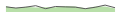
| Category | Series 1 |
|---|---|
| 0 | 86 |
| 1 | 66 |
| 2 | 81 |
| 3 | 105 |
| 4 | 55 |
| 5 | 92 |
| 6 | 85 |
| 7 | 81 |
| 8 | 55 |
| 9 | 79 |
| 10 | 115 |
| 11 | 71 |